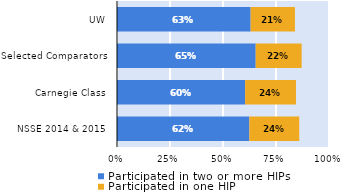
| Category | Participated in two or more HIPs | Participated in one HIP |
|---|---|---|
| NSSE 2014 & 2015 | 0.624 | 0.235 |
| Carnegie Class | 0.604 | 0.24 |
| Selected Comparators | 0.654 | 0.217 |
| UW | 0.63 | 0.209 |